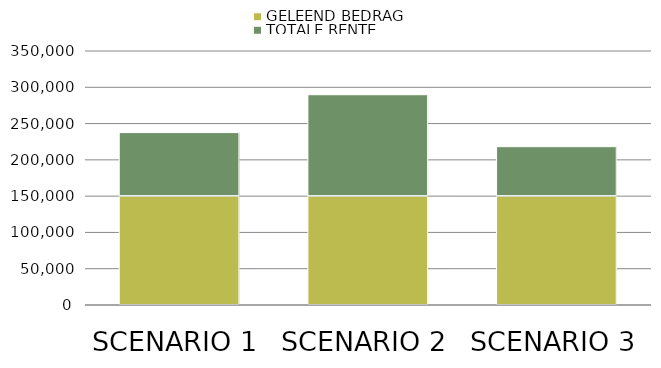
| Category | GELEEND BEDRAG | TOTALE RENTE |
|---|---|---|
| SCENARIO 1 | 150000 | 87584.066 |
| SCENARIO 2 | 150000 | 139753.762 |
| SCENARIO 3 | 150000 | 68152.919 |